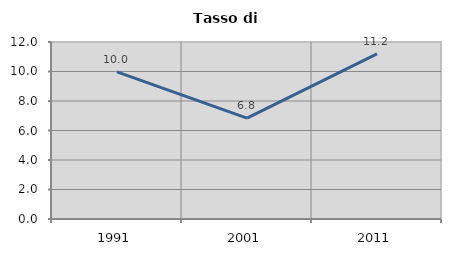
| Category | Tasso di disoccupazione   |
|---|---|
| 1991.0 | 9.979 |
| 2001.0 | 6.838 |
| 2011.0 | 11.19 |